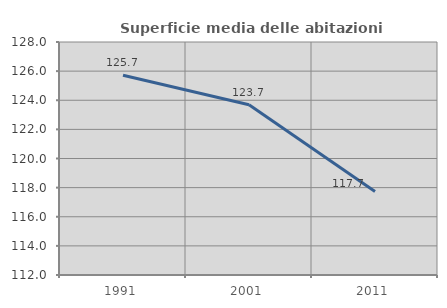
| Category | Superficie media delle abitazioni occupate |
|---|---|
| 1991.0 | 125.721 |
| 2001.0 | 123.697 |
| 2011.0 | 117.73 |